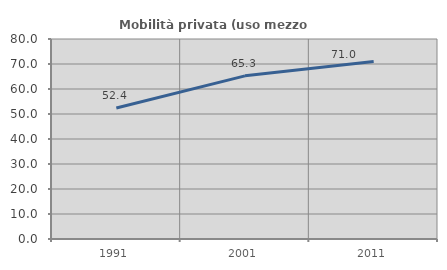
| Category | Mobilità privata (uso mezzo privato) |
|---|---|
| 1991.0 | 52.392 |
| 2001.0 | 65.263 |
| 2011.0 | 70.957 |